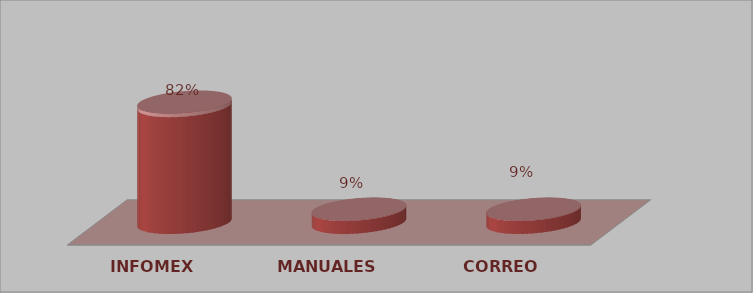
| Category | Series 0 | Series 1 |
|---|---|---|
| INFOMEX | 27 | 0.818 |
| MANUALES | 3 | 0.091 |
| CORREO | 3 | 0.091 |